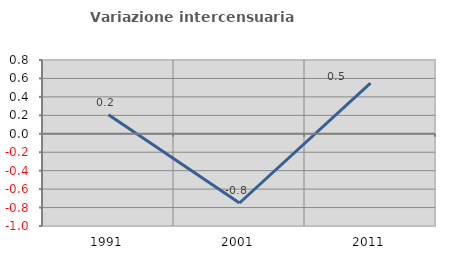
| Category | Variazione intercensuaria annua |
|---|---|
| 1991.0 | 0.205 |
| 2001.0 | -0.751 |
| 2011.0 | 0.55 |